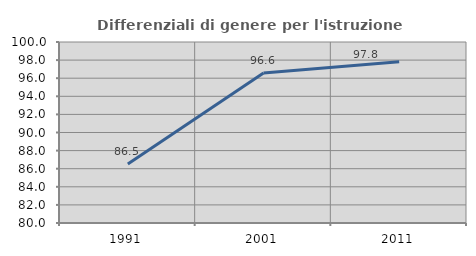
| Category | Differenziali di genere per l'istruzione superiore |
|---|---|
| 1991.0 | 86.51 |
| 2001.0 | 96.571 |
| 2011.0 | 97.81 |